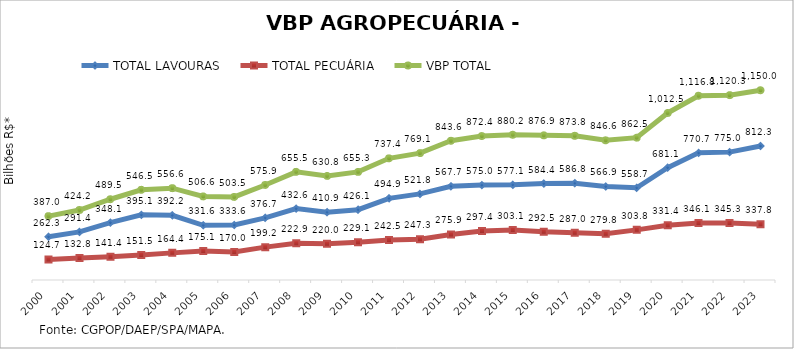
| Category | TOTAL LAVOURAS | TOTAL PECUÁRIA | VBP TOTAL |
|---|---|---|---|
| 2000 | 262.316 | 124.672 | 386.988 |
| 2001 | 291.385 | 132.846 | 424.23 |
| 2002 | 348.069 | 141.406 | 489.475 |
| 2003 | 395.056 | 151.465 | 546.521 |
| 2004 | 392.163 | 164.421 | 556.584 |
| 2005 | 331.556 | 175.077 | 506.634 |
| 2006 | 333.582 | 169.959 | 503.54 |
| 2007 | 376.72 | 199.156 | 575.875 |
| 2008 | 432.567 | 222.915 | 655.483 |
| 2009 | 410.882 | 219.953 | 630.835 |
| 2010 | 426.13 | 229.123 | 655.253 |
| 2011 | 494.897 | 242.487 | 737.384 |
| 2012 | 521.809 | 247.322 | 769.131 |
| 2013 | 567.731 | 275.903 | 843.635 |
| 2014 | 575.036 | 297.391 | 872.427 |
| 2015 | 577.122 | 303.105 | 880.227 |
| 2016 | 584.42 | 292.465 | 876.885 |
| 2017 | 586.846 | 286.986 | 873.833 |
| 2018 | 566.861 | 279.789 | 846.65 |
| 2019 | 558.709 | 303.829 | 862.538 |
| 2020 | 681.079 | 331.371 | 1012.451 |
| 2021 | 770.658 | 346.123 | 1116.78 |
| 2022 | 775 | 345.298 | 1120.298 |
| 2023 | 812.254 | 337.753 | 1150.007 |